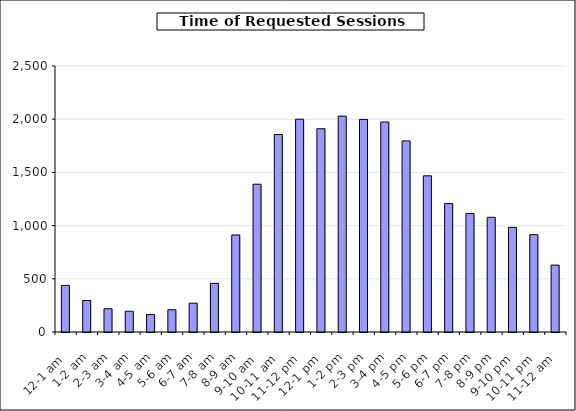
| Category | Series 0 |
|---|---|
| 12-1 am | 438 |
| 1-2 am | 296 |
| 2-3 am | 219 |
| 3-4 am | 195 |
| 4-5 am | 164 |
| 5-6 am | 209 |
| 6-7 am | 271 |
| 7-8 am | 457 |
| 8-9 am | 912 |
| 9-10 am | 1389 |
| 10-11 am | 1856 |
| 11-12 pm | 2000 |
| 12-1 pm | 1910 |
| 1-2 pm | 2029 |
| 2-3 pm | 1998 |
| 3-4 pm | 1974 |
| 4-5 pm | 1796 |
| 5-6 pm | 1468 |
| 6-7 pm | 1207 |
| 7-8 pm | 1113 |
| 8-9 pm | 1078 |
| 9-10 pm | 983 |
| 10-11 pm | 915 |
| 11-12 am | 629 |